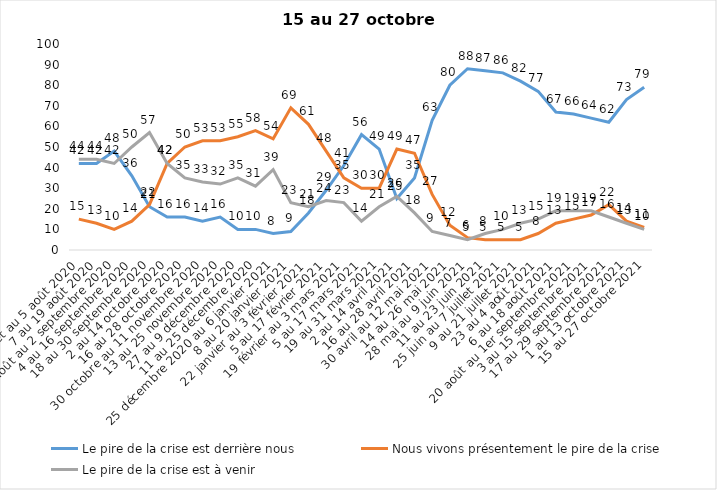
| Category | Le pire de la crise est derrière nous | Nous vivons présentement le pire de la crise | Le pire de la crise est à venir |
|---|---|---|---|
| 24 juillet au 5 août 2020 | 42 | 15 | 44 |
| 7 au 19 août 2020 | 42 | 13 | 44 |
| 21 août au 2 septembre 2020 | 48 | 10 | 42 |
| 4 au 16 septembre 2020 | 36 | 14 | 50 |
| 18 au 30 septembre 2020 | 21 | 22 | 57 |
| 2 au 14 octobre 2020 | 16 | 42 | 42 |
| 16 au 28 octobre 2020 | 16 | 50 | 35 |
| 30 octobre au 11 novembre 2020 | 14 | 53 | 33 |
| 13 au 25 novembre 2020 | 16 | 53 | 32 |
| 27 au 9 décembre 2020 | 10 | 55 | 35 |
| 11 au 25 décembre 2020 | 10 | 58 | 31 |
| 25 décembre 2020 au 6 janvier 2021 | 8 | 54 | 39 |
| 8 au 20 janvier 2021 | 9 | 69 | 23 |
| 22 janvier au 3 février 2021 | 18 | 61 | 21 |
| 5 au 17 février 2021 | 29 | 48 | 24 |
| 19 février au 3 mars 2021 | 41 | 35 | 23 |
| 5 au 17 mars 2021 | 56 | 30 | 14 |
| 19 au 31 mars 2021 | 49 | 30 | 21 |
| 2 au 14 avril 2021 | 25 | 49 | 26 |
| 16 au 28 avril 2021 | 35 | 47 | 18 |
| 30 avril au 12 mai 2021 | 63 | 27 | 9 |
| 14 au 26 mai 2021 | 80 | 12 | 7 |
| 28 mai au 9 juin 2021 | 88 | 6 | 5 |
| 11 au 23 juin 2021 | 87 | 5 | 8 |
| 25 juin au 7 juillet 2021 | 86 | 5 | 10 |
| 9 au 21 juillet 2021 | 82 | 5 | 13 |
| 23 au 4 août 2021 | 77 | 8 | 15 |
| 6 au 18 août 2021 | 67 | 13 | 19 |
| 20 août au 1er septembre 2021 | 66 | 15 | 19 |
| 3 au 15 septembre 2021 | 64 | 17 | 19 |
| 17 au 29 septembre 2021 | 62 | 22 | 16 |
| 1 au 13 octobre 2021 | 73 | 14 | 13 |
| 15 au 27 octobre 2021 | 79 | 11 | 10 |